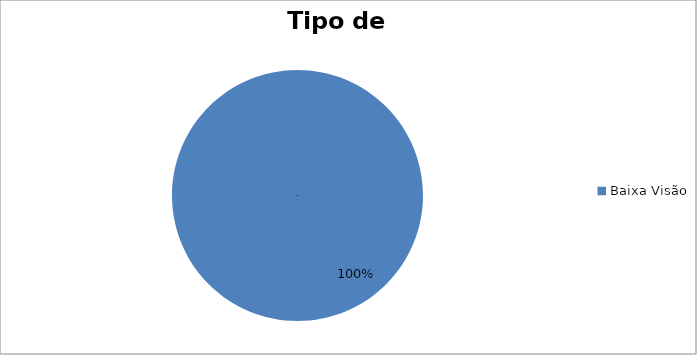
| Category | Quantitativo |
|---|---|
| Baixa Visão | 1 |